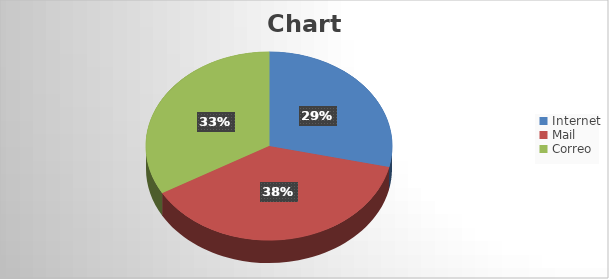
| Category | Series 0 |
|---|---|
| Internet | 6 |
| Mail | 8 |
| Correo | 7 |